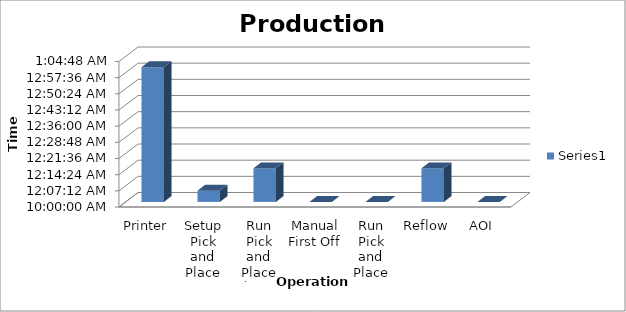
| Category | Series 0 |
|---|---|
| Printer | 0.042 |
| Setup Pick and Place | 0.003 |
| Run Pick and Place (First Board) | 0.01 |
| Manual First Off | 0 |
| Run Pick and Place | 0 |
| Reflow | 0.01 |
| AOI | 0 |